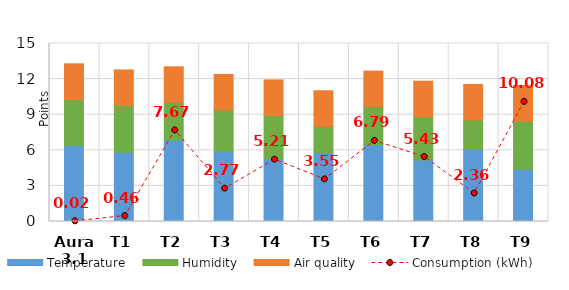
| Category | Temperature | Humidity | Air quality |
|---|---|---|---|
| Aura 3.1 | 6.429 | 3.859 | 3 |
| T1 | 5.846 | 3.928 | 3 |
| T2 | 6.853 | 3.182 | 3 |
| T3 | 5.91 | 3.482 | 3 |
| T4 | 5.268 | 3.665 | 3 |
| T5 | 5.815 | 2.201 | 3 |
| T6 | 6.488 | 3.186 | 3 |
| T7 | 5.188 | 3.637 | 3 |
| T8 | 6.064 | 2.486 | 3 |
| T9 | 4.395 | 4.064 | 3 |